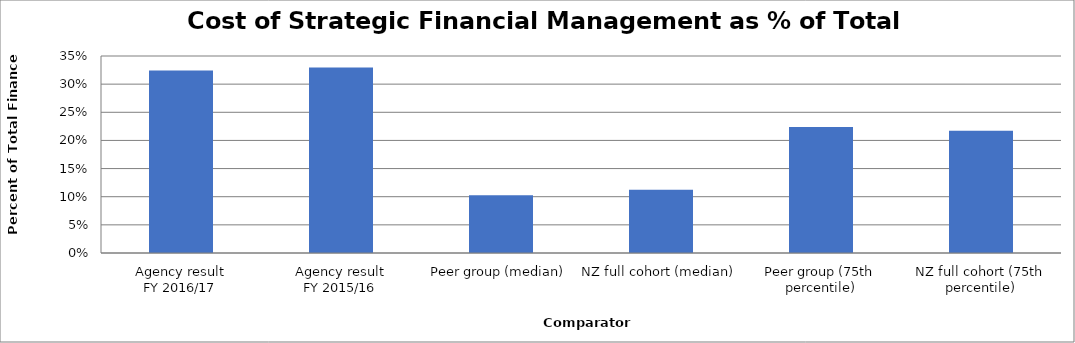
| Category | Result |
|---|---|
| Agency result
FY 2016/17 | 0.324 |
| Agency result
FY 2015/16 | 0.33 |
| Peer group (median) | 0.102 |
| NZ full cohort (median) | 0.112 |
| Peer group (75th percentile) | 0.224 |
| NZ full cohort (75th percentile) | 0.217 |